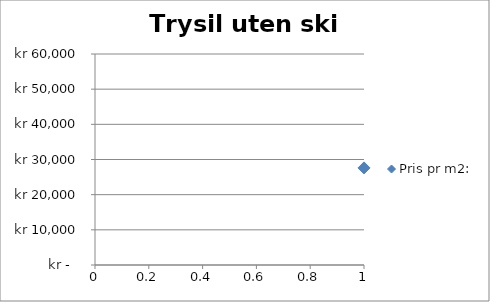
| Category | Pris pr m2: |
|---|---|
| 0 | 27612 |
| 1 | 28125 |
| 2 | 21359 |
| 3 | 24299 |
| 4 | 29365 |
| 5 | 19863 |
| 6 | 16667 |
| 7 | 40390 |
| 8 | 22903 |
| 9 | 25521 |
| 10 | 28226 |
| 11 | 20192 |
| 12 | 37500 |
| 13 | 23148 |
| 14 | 22110 |
| 15 | 17500 |
| 16 | 23394 |
| 17 | 33355 |
| 18 | 21875 |
| 19 | 26016 |
| 20 | 38571 |
| 21 | 45000 |
| 22 | 25633 |
| 23 | 19780 |
| 24 | 22381 |
| 25 | 30147 |
| 26 | 27500 |
| 27 | 21642 |
| 28 | 31429 |
| 29 | 25417 |
| 30 | 25000 |
| 31 | 15230 |
| 32 | 34574 |
| 33 | 31912 |
| 34 | 21477 |
| 35 | 30833 |
| 36 | 37869 |
| 37 | 23832 |
| 38 | 21087 |
| 39 | 33758 |
| 40 | 30515 |
| 41 | 27404 |
| 42 | 34804 |
| 43 | 33789 |
| 44 | 25714 |
| 45 | 28571 |
| 46 | 28431 |
| 47 | 26623 |
| 48 | 33636 |
| 49 | 28906 |
| 50 | 30405 |
| 51 | 21528 |
| 52 | 26393 |
| 53 | 17308 |
| 54 | 25000 |
| 55 | 21854 |
| 56 | 18269 |
| 57 | 30633 |
| 58 | 24688 |
| 59 | 31250 |
| 60 | 23538 |
| 61 | 20833 |
| 62 | 33867 |
| 63 | 26000 |
| 64 | 30049 |
| 65 | 34400 |
| 66 | 26763 |
| 67 | 16346 |
| 68 | 21806 |
| 69 | 28333 |
| 70 | 21528 |
| 71 | 20833 |
| 72 | 28302 |
| 73 | 30000 |
| 74 | 28182 |
| 75 | 39506 |
| 76 | 32581 |
| 77 | 34444 |
| 78 | 29464 |
| 79 | 22892 |
| 80 | 28571 |
| 81 | 17722 |
| 82 | 35659 |
| 83 | 26623 |
| 84 | 31928 |
| 85 | 28472 |
| 86 | 28833 |
| 87 | 24621 |
| 88 | 37184 |
| 89 | 32870 |
| 90 | 37255 |
| 91 | 23227 |
| 92 | 23385 |
| 93 | 22426 |
| 94 | 37931 |
| 95 | 27619 |
| 96 | 32870 |
| 97 | 25000 |
| 98 | 30682 |
| 99 | 24275 |
| 100 | 29851 |
| 101 | 23750 |
| 102 | 30172 |
| 103 | 28380 |
| 104 | 26724 |
| 105 | 27273 |
| 106 | 32333 |
| 107 | 39831 |
| 108 | 17308 |
| 109 | 38052 |
| 110 | 24296 |
| 111 | 34426 |
| 112 | 22059 |
| 113 | 30189 |
| 114 | 17788 |
| 115 | 32258 |
| 116 | 27068 |
| 117 | 24529 |
| 118 | 28571 |
| 119 | 25691 |
| 120 | 16346 |
| 121 | 29091 |
| 122 | 29000 |
| 123 | 24095 |
| 124 | 30000 |
| 125 | 29032 |
| 126 | 30000 |
| 127 | 23810 |
| 128 | 36513 |
| 129 | 29565 |
| 130 | 22973 |
| 131 | 32765 |
| 132 | 24845 |
| 133 | 30000 |
| 134 | 26852 |
| 135 | 28279 |
| 136 | 34014 |
| 137 | 25591 |
| 138 | 21944 |
| 139 | 27889 |
| 140 | 27273 |
| 141 | 27586 |
| 142 | 28955 |
| 143 | 36000 |
| 144 | 35484 |
| 145 | 32273 |
| 146 | 31081 |
| 147 | 27833 |
| 148 | 26346 |
| 149 | 27586 |
| 150 | 26042 |
| 151 | 34574 |
| 152 | 26136 |
| 153 | 23894 |
| 154 | 35909 |
| 155 | 25000 |
| 156 | 34314 |
| 157 | 23381 |
| 158 | 18621 |
| 159 | 36735 |
| 160 | 34615 |
| 161 | 27941 |
| 162 | 18269 |
| 163 | 27049 |
| 164 | 28409 |
| 165 | 28395 |
| 166 | 36429 |
| 167 | 31534 |
| 168 | 20902 |
| 169 | 28960 |
| 170 | 28333 |
| 171 | 29583 |
| 172 | 31868 |
| 173 | 27049 |
| 174 | 27500 |
| 175 | 37500 |
| 176 | 40164 |
| 177 | 49395 |
| 178 | 25983 |
| 179 | 19481 |
| 180 | 30000 |
| 181 | 32000 |
| 182 | 25000 |
| 183 | 25357 |
| 184 | 33803 |
| 185 | 27961 |
| 186 | 35909 |
| 187 | 26210 |
| 188 | 24658 |
| 189 | 24783 |
| 190 | 23134 |
| 191 | 15987 |
| 192 | 34483 |
| 193 | 29779 |
| 194 | 38667 |
| 195 | 39535 |
| 196 | 18561 |
| 197 | 24695 |
| 198 | 30500 |
| 199 | 34127 |
| 200 | 35484 |
| 201 | 29688 |
| 202 | 25000 |
| 203 | 25000 |
| 204 | 19291 |
| 205 | 30702 |
| 206 | 40517 |
| 207 | 34173 |
| 208 | 31690 |
| 209 | 34783 |
| 210 | 19652 |
| 211 | 39568 |
| 212 | 22266 |
| 213 | 31429 |
| 214 | 27172 |
| 215 | 25820 |
| 216 | 35256 |
| 217 | 31959 |
| 218 | 28971 |
| 219 | 27344 |
| 220 | 29616 |
| 221 | 38571 |